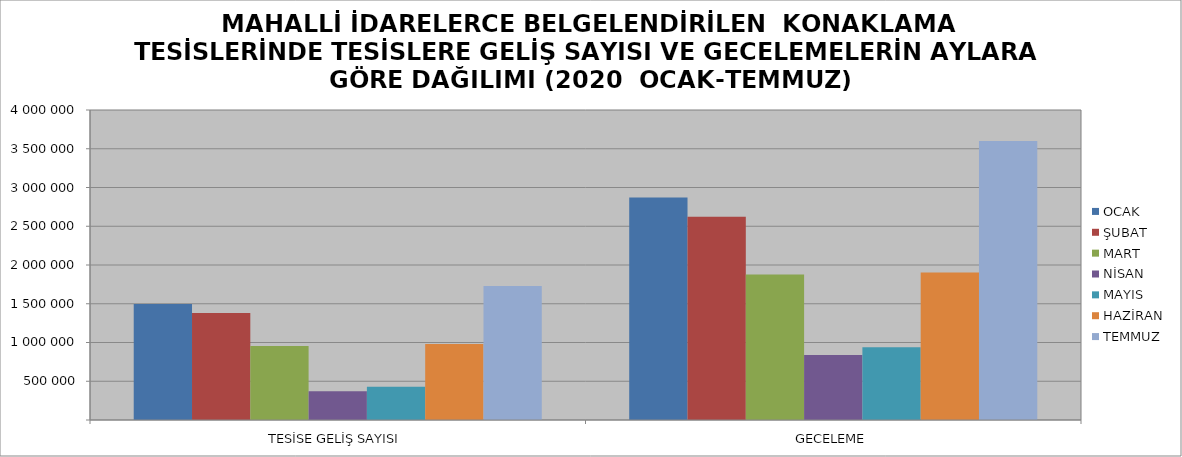
| Category | OCAK | ŞUBAT | MART | NİSAN | MAYIS | HAZİRAN | TEMMUZ |
|---|---|---|---|---|---|---|---|
| TESİSE GELİŞ SAYISI | 1497815 | 1380765 | 955554 | 372466 | 430328 | 981538 | 1730606 |
| GECELEME | 2872303 | 2621819 | 1878971 | 839735 | 939652 | 1902057 | 3601580 |